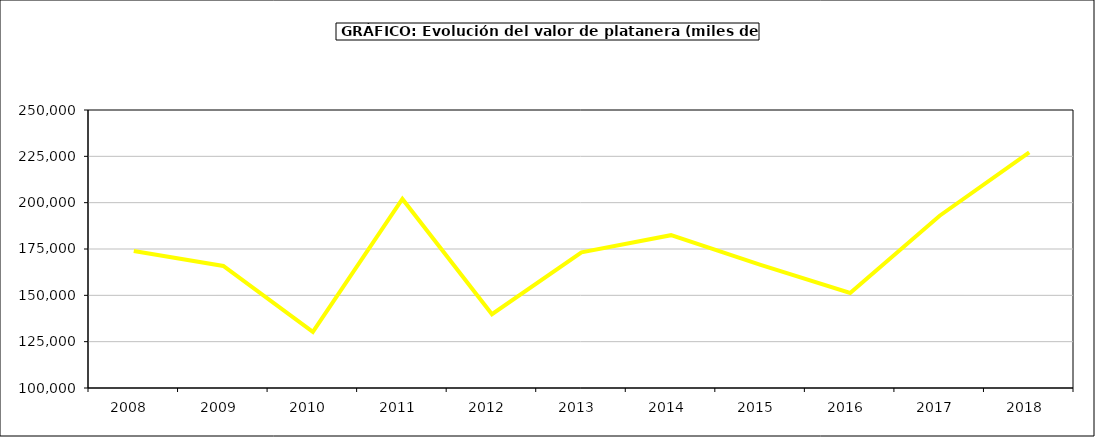
| Category | valor platanera |
|---|---|
| 2008.0 | 173883.195 |
| 2009.0 | 165826.349 |
| 2010.0 | 130319.145 |
| 2011.0 | 202014.747 |
| 2012.0 | 139816.382 |
| 2013.0 | 173165.464 |
| 2014.0 | 182466.749 |
| 2015.0 | 166392 |
| 2016.0 | 151266 |
| 2017.0 | 192961.354 |
| 2018.0 | 227178.133 |